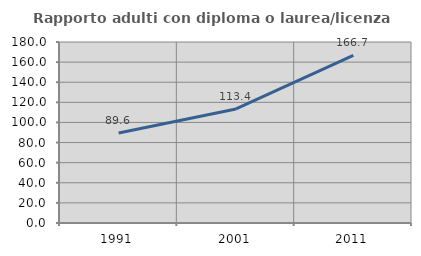
| Category | Rapporto adulti con diploma o laurea/licenza media  |
|---|---|
| 1991.0 | 89.572 |
| 2001.0 | 113.394 |
| 2011.0 | 166.651 |